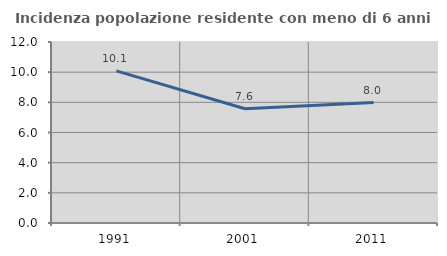
| Category | Incidenza popolazione residente con meno di 6 anni |
|---|---|
| 1991.0 | 10.085 |
| 2001.0 | 7.574 |
| 2011.0 | 7.983 |